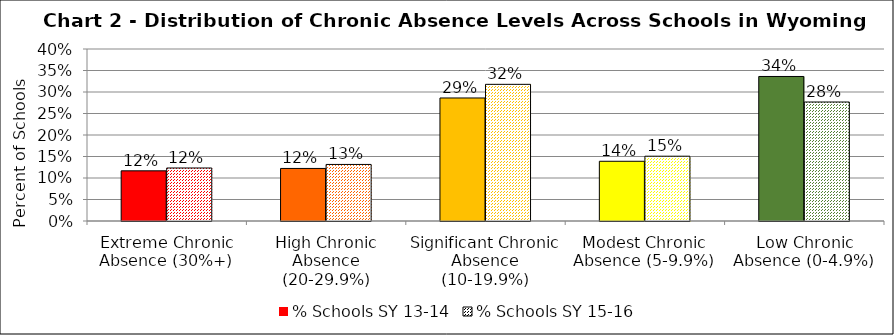
| Category | % Schools SY 13-14 | % Schools SY 15-16 |
|---|---|---|
| Extreme Chronic Absence (30%+) | 0.117 | 0.123 |
| High Chronic Absence (20-29.9%) | 0.122 | 0.132 |
| Significant Chronic Absence (10-19.9%) | 0.286 | 0.318 |
| Modest Chronic Absence (5-9.9%) | 0.139 | 0.151 |
| Low Chronic Absence (0-4.9%) | 0.336 | 0.277 |